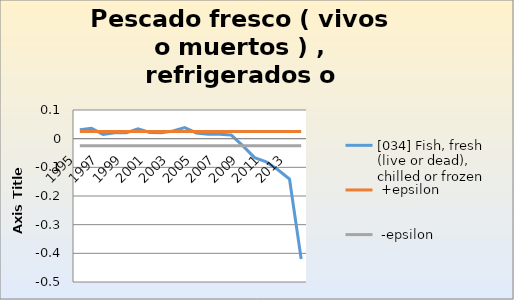
| Category | [034] Fish, fresh (live or dead), chilled or frozen |  +epsilon |  -epsilon |
|---|---|---|---|
| 1995.0 | 0.031 | 0.025 | -0.025 |
| 1996.0 | 0.036 | 0.025 | -0.025 |
| 1997.0 | 0.015 | 0.025 | -0.025 |
| 1998.0 | 0.02 | 0.025 | -0.025 |
| 1999.0 | 0.021 | 0.025 | -0.025 |
| 2000.0 | 0.034 | 0.025 | -0.025 |
| 2001.0 | 0.021 | 0.025 | -0.025 |
| 2002.0 | 0.02 | 0.025 | -0.025 |
| 2003.0 | 0.027 | 0.025 | -0.025 |
| 2004.0 | 0.039 | 0.025 | -0.025 |
| 2005.0 | 0.02 | 0.025 | -0.025 |
| 2006.0 | 0.016 | 0.025 | -0.025 |
| 2007.0 | 0.015 | 0.025 | -0.025 |
| 2008.0 | 0.013 | 0.025 | -0.025 |
| 2009.0 | -0.025 | 0.025 | -0.025 |
| 2010.0 | -0.066 | 0.025 | -0.025 |
| 2011.0 | -0.081 | 0.025 | -0.025 |
| 2012.0 | -0.109 | 0.025 | -0.025 |
| 2013.0 | -0.141 | 0.025 | -0.025 |
| 2014.0 | -0.419 | 0.025 | -0.025 |